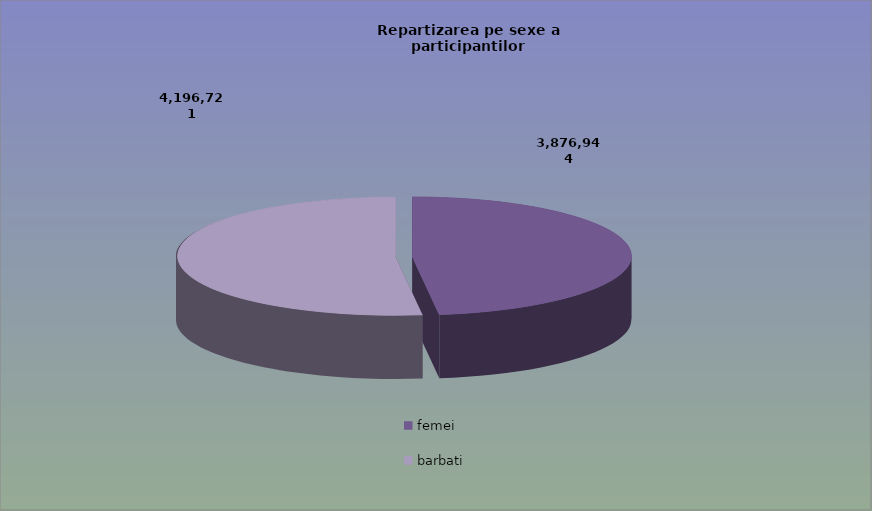
| Category | Series 0 |
|---|---|
| femei | 3876944 |
| barbati | 4196721 |